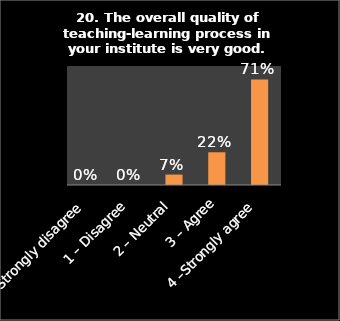
| Category | Series 0 |
|---|---|
| 0 – Strongly disagree | 0 |
| 1 – Disagree | 0 |
| 2 – Neutral | 0.07 |
| 3 – Agree | 0.22 |
| 4 –Strongly agree | 0.71 |